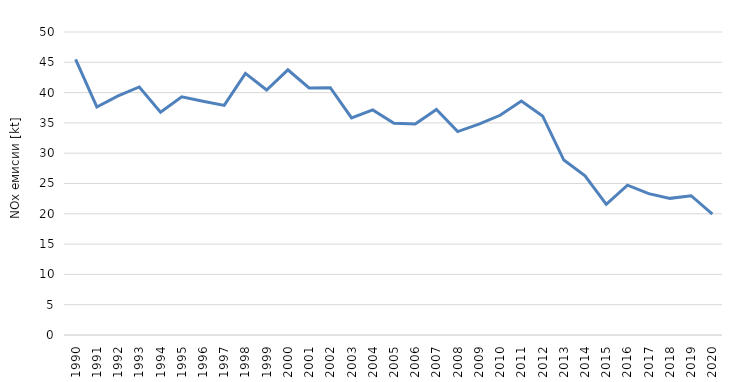
| Category | Series 0 |
|---|---|
| 1990.0 | 45.472 |
| 1991.0 | 37.628 |
| 1992.0 | 39.462 |
| 1993.0 | 40.931 |
| 1994.0 | 36.745 |
| 1995.0 | 39.293 |
| 1996.0 | 38.565 |
| 1997.0 | 37.89 |
| 1998.0 | 43.177 |
| 1999.0 | 40.43 |
| 2000.0 | 43.763 |
| 2001.0 | 40.76 |
| 2002.0 | 40.811 |
| 2003.0 | 35.825 |
| 2004.0 | 37.145 |
| 2005.0 | 34.937 |
| 2006.0 | 34.826 |
| 2007.0 | 37.215 |
| 2008.0 | 33.56 |
| 2009.0 | 34.792 |
| 2010.0 | 36.257 |
| 2011.0 | 38.609 |
| 2012.0 | 36.143 |
| 2013.0 | 28.87 |
| 2014.0 | 26.273 |
| 2015.0 | 21.552 |
| 2016.0 | 24.715 |
| 2017.0 | 23.33 |
| 2018.0 | 22.548 |
| 2019.0 | 22.981 |
| 2020.0 | 19.938 |